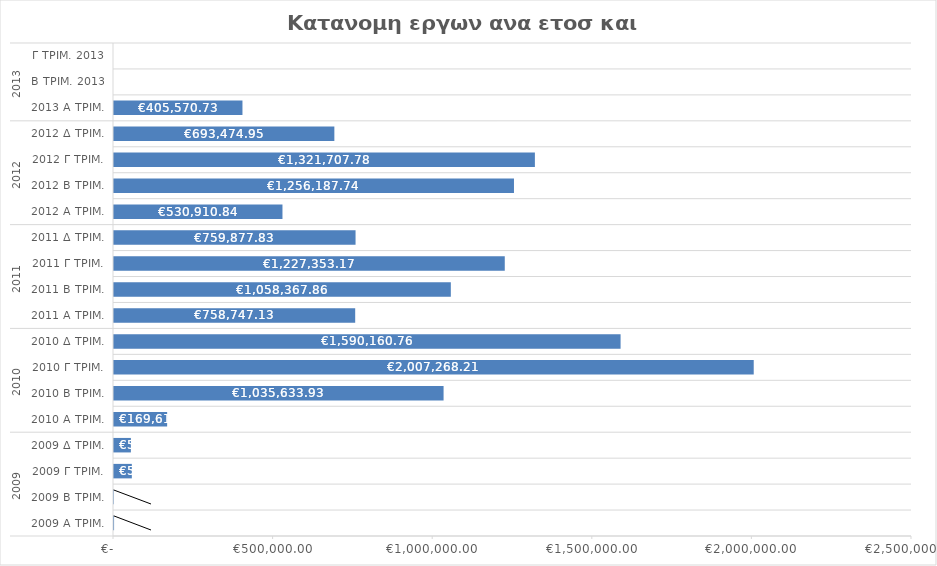
| Category | Total |
|---|---|
| 0 | 3353.903 |
| 1 | 2191.817 |
| 2 | 58993.685 |
| 3 | 56034.273 |
| 4 | 169615.843 |
| 5 | 1035633.933 |
| 6 | 2007268.21 |
| 7 | 1590160.761 |
| 8 | 758747.134 |
| 9 | 1058367.856 |
| 10 | 1227353.173 |
| 11 | 759877.826 |
| 12 | 530910.84 |
| 13 | 1256187.74 |
| 14 | 1321707.78 |
| 15 | 693474.954 |
| 16 | 405570.732 |
| 17 | 0 |
| 18 | 0 |